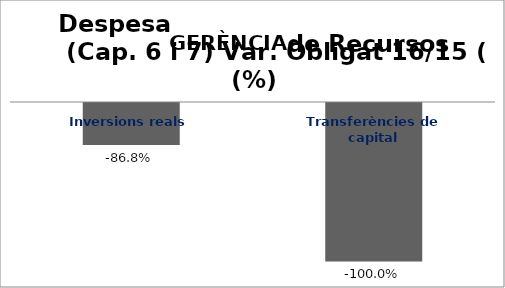
| Category | Series 0 |
|---|---|
| Inversions reals | -0.868 |
| Transferències de capital | -1 |